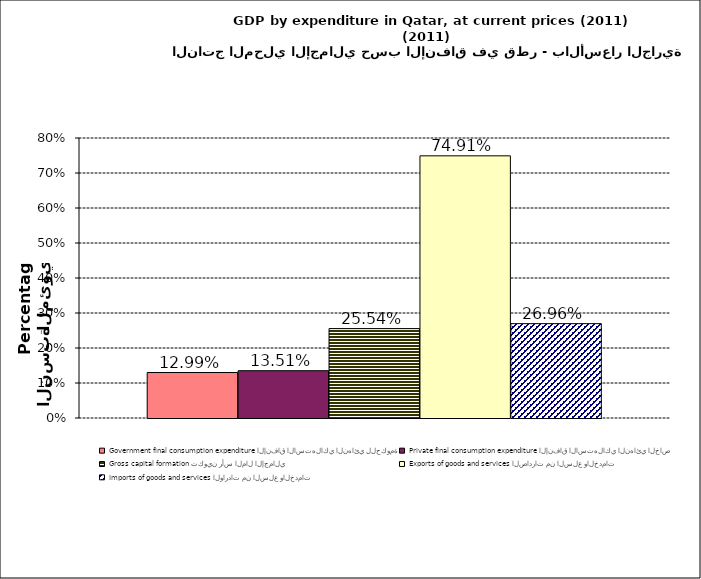
| Category | Government final consumption expenditure الإنفاق الاستهلاكي النهائي للحكومة | Private final consumption expenditure الإنفاق الاستهلاكي النهائي الخاص | Gross capital formation تكوين رأس المال الإجمالي | Exports of goods and services الصادرات من السلع والخدمات | Imports of goods and services الواردات من السلع والخدمات |
|---|---|---|---|---|---|
| 0 | 0.13 | 0.135 | 0.255 | 0.749 | 0.27 |